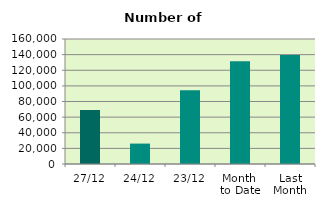
| Category | Series 0 |
|---|---|
| 27/12 | 69110 |
| 24/12 | 26140 |
| 23/12 | 94478 |
| Month 
to Date | 131617.895 |
| Last
Month | 139642.182 |